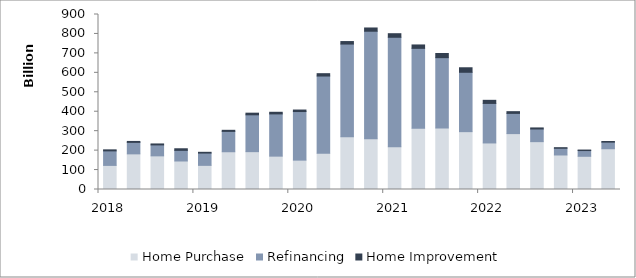
| Category | Filing Quarter | Home Purchase | Refinancing | Home Improvement |
|---|---|---|---|---|
| 2018 |  | 123918265027 | 74690371787 | 5301523310 |
| 2018 |  | 183305206616 | 59053391038 | 4783614107 |
| 2018 |  | 173035680065 | 56269972282 | 4971421243 |
| 2018 |  | 146582947480 | 54748609396 | 8157899656 |
| 2019 |  | 124167950342 | 63182176214 | 3940300862 |
| 2019 |  | 194164936334 | 104689106436 | 5528693711 |
| 2019 |  | 194660962864 | 189455818161 | 8448960420 |
| 2019 |  | 171566080770 | 217176191066 | 8415060739 |
| 2020 |  | 151038464715 | 249883355055 | 7769524822 |
| 2020 |  | 185834970238 | 397699561291 | 12119142715 |
| 2020 |  | 271545152908 | 476415225210 | 12915024509 |
| 2020 |  | 260716086828 | 553230462737 | 16736792161 |
| 2021 |  | 219373193417 | 563437539008 | 18406907072 |
| 2021 |  | 314601426960 | 411286136949 | 17517458279 |
| 2021 |  | 316080186159 | 361987934670 | 21478380391 |
| 2021 |  | 297500854357 | 305331305905 | 23246373748 |
| 2022 |  | 239378400011 | 203309402014 | 15906744805 |
| 2022 |  | 287451455550 | 104016880177 | 8858764726 |
| 2022 |  | 246034181950 | 65197876752 | 5407453396 |
| 2022 |  | 177527405262 | 34553702136 | 2907840586 |
| 2023 |  | 170785999324 | 29462048768 | 2644244216 |
| 2023 |  | 209645822870 | 33891889738 | 3227185069 |